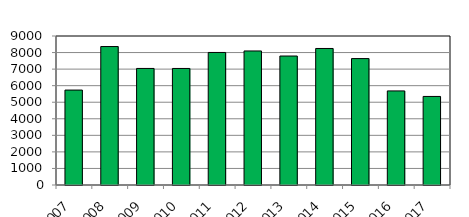
| Category | Series 1 |
|---|---|
| 2007 | 5734 |
| 2008 | 8363 |
| 2009 | 7040 |
| 2010 | 7039 |
| 2011 | 8006 |
| 2012 | 8096 |
| 2013 | 7791 |
| 2014 | 8246 |
| 2015 | 7636 |
| 2016 | 5683 |
| 2017 | 5349 |